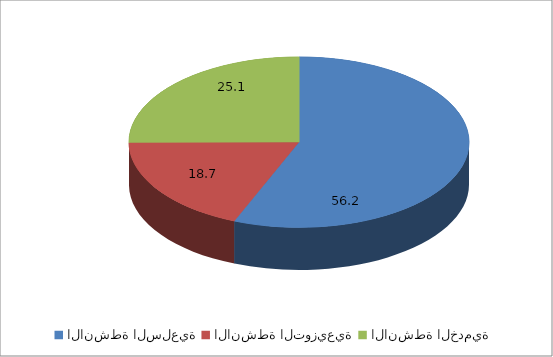
| Category | Series 0 |
|---|---|
| الانشطة السلعية | 56.2 |
| الانشطة التوزيعية | 18.7 |
| الانشطة الخدمية | 25.1 |